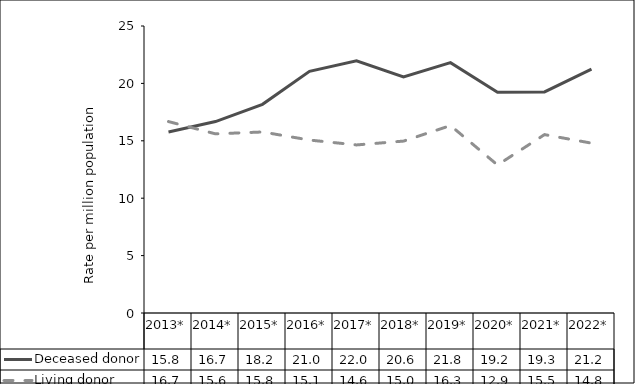
| Category | Deceased donor | Living donor |
|---|---|---|
| 2013* | 15.763 | 16.675 |
| 2014* | 16.677 | 15.605 |
| 2015* | 18.178 | 15.769 |
| 2016* | 21.047 | 15.065 |
| 2017* | 21.973 | 14.639 |
| 2018* | 20.558 | 14.974 |
| 2019* | 21.808 | 16.329 |
| 2020* | 19.233 | 12.892 |
| 2021* | 19.254 | 15.539 |
| 2022* | 21.243 | 14.796 |